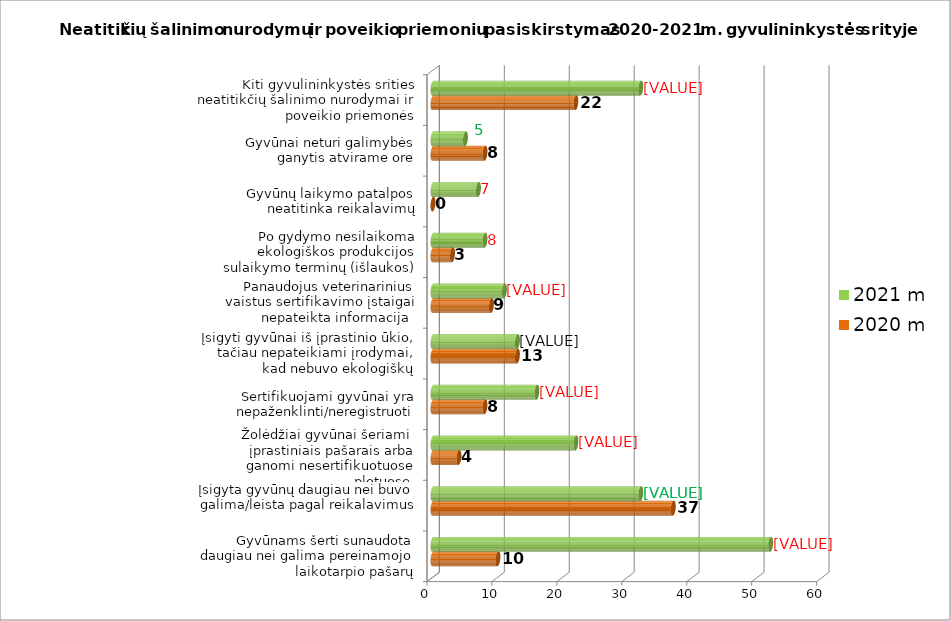
| Category | 2020 m  | 2021 m  |
|---|---|---|
| Gyvūnams šerti sunaudota daugiau nei galima pereinamojo laikotarpio pašarų | 10 | 52 |
| Įsigyta gyvūnų daugiau nei buvo galima/leista pagal reikalavimus | 37 | 32 |
| Žolėdžiai gyvūnai šeriami  įprastiniais pašarais arba ganomi nesertifikuotuose plotuose  | 4 | 22 |
| Sertifikuojami gyvūnai yra nepaženklinti/neregistruoti | 8 | 16 |
| Įsigyti gyvūnai iš įprastinio ūkio, tačiau nepateikiami įrodymai, kad nebuvo ekologiškų | 13 | 13 |
| Panaudojus veterinarinius vaistus sertifikavimo įstaigai nepateikta informacija  | 9 | 11 |
| Po gydymo nesilaikoma ekologiškos produkcijos sulaikymo terminų (išlaukos) | 3 | 8 |
| Gyvūnų laikymo patalpos neatitinka reikalavimų | 0 | 7 |
| Gyvūnai neturi galimybės ganytis atvirame ore | 8 | 5 |
| Kiti gyvulininkystės srities neatitikčių šalinimo nurodymai ir poveikio priemonės | 22 | 32 |